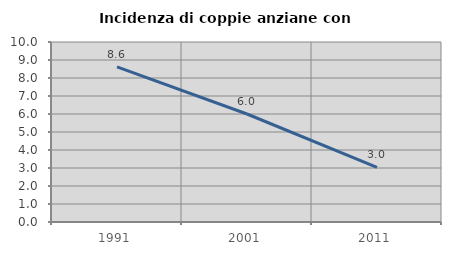
| Category | Incidenza di coppie anziane con figli |
|---|---|
| 1991.0 | 8.621 |
| 2001.0 | 6 |
| 2011.0 | 3.03 |